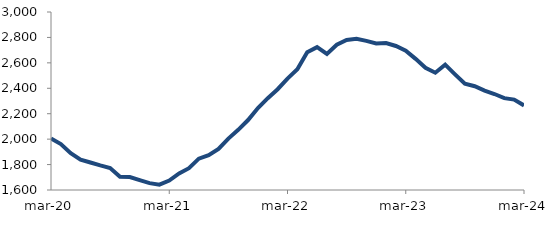
| Category | Series 0 |
|---|---|
| 2020-03-01 | 2005.967 |
| 2020-04-01 | 1961.731 |
| 2020-05-01 | 1889.917 |
| 2020-06-01 | 1839.086 |
| 2020-07-01 | 1816.171 |
| 2020-08-01 | 1793.174 |
| 2020-09-01 | 1772.502 |
| 2020-10-01 | 1703.481 |
| 2020-11-01 | 1701.776 |
| 2020-12-01 | 1677.184 |
| 2021-01-01 | 1654.072 |
| 2021-02-01 | 1641.869 |
| 2021-03-01 | 1673.821 |
| 2021-04-01 | 1730.759 |
| 2021-05-01 | 1771.425 |
| 2021-06-01 | 1846.573 |
| 2021-07-01 | 1874.111 |
| 2021-08-01 | 1922.894 |
| 2021-09-01 | 2004.225 |
| 2021-10-01 | 2073.331 |
| 2021-11-01 | 2150.314 |
| 2021-12-01 | 2244.492 |
| 2022-01-01 | 2321.95 |
| 2022-02-01 | 2392.65 |
| 2022-03-01 | 2476.383 |
| 2022-04-01 | 2549.069 |
| 2022-05-01 | 2683.336 |
| 2022-06-01 | 2723.868 |
| 2022-07-01 | 2670.585 |
| 2022-08-01 | 2742.913 |
| 2022-09-01 | 2780.46 |
| 2022-10-01 | 2788.916 |
| 2022-11-01 | 2772.628 |
| 2022-12-01 | 2752.307 |
| 2023-01-01 | 2755.69 |
| 2023-02-01 | 2732.653 |
| 2023-03-01 | 2696.107 |
| 2023-04-01 | 2631.454 |
| 2023-05-01 | 2561.826 |
| 2023-06-01 | 2522.703 |
| 2023-07-01 | 2586.296 |
| 2023-08-01 | 2509.777 |
| 2023-09-01 | 2436.109 |
| 2023-10-01 | 2416.11 |
| 2023-11-01 | 2381.816 |
| 2023-12-01 | 2354.903 |
| 2024-01-01 | 2322.347 |
| 2024-02-01 | 2311.108 |
| 2024-03-01 | 2265.037 |